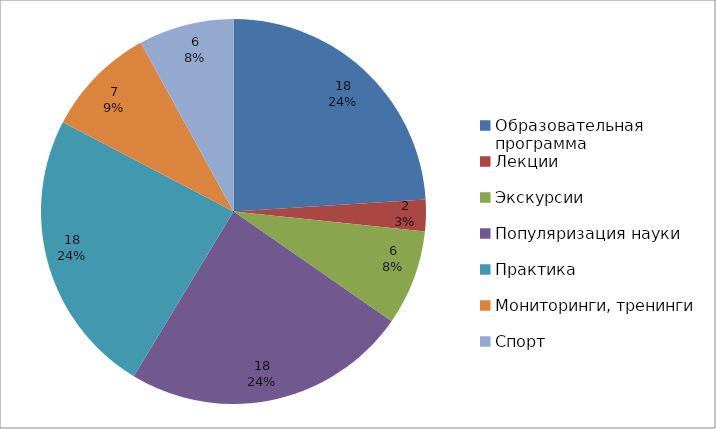
| Category | Series 0 |
|---|---|
| Образовательная программа | 18 |
| Лекции | 2 |
| Экскурсии | 6 |
| Популяризация науки | 18 |
| Практика | 18 |
| Мониторинги, тренинги | 7 |
| Спорт | 6 |